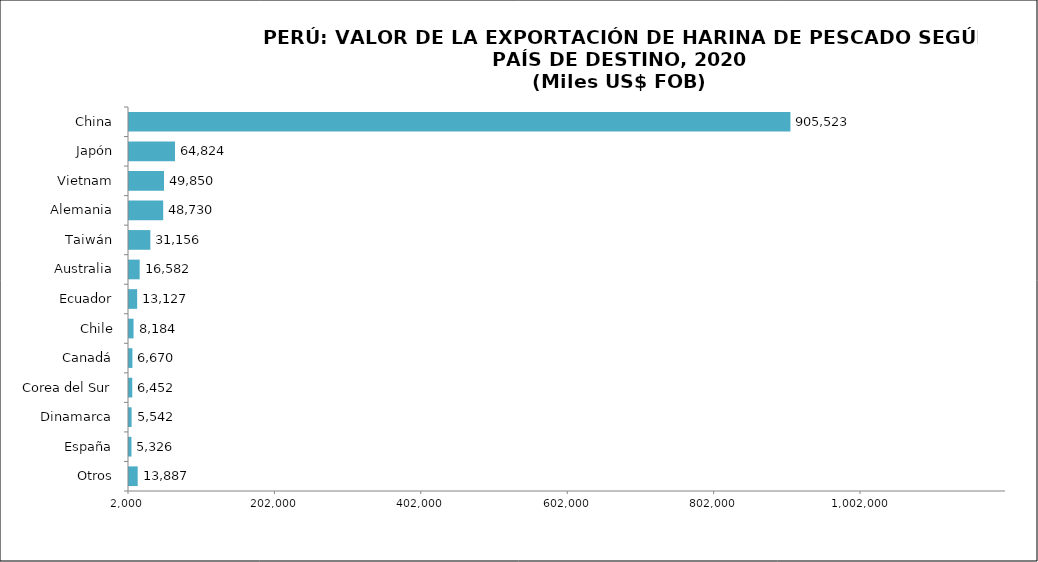
| Category | Series 0 |
|---|---|
| Otros | 13886.614 |
| España | 5325.584 |
| Dinamarca | 5542.198 |
| Corea del Sur | 6451.621 |
| Canadá | 6669.961 |
| Chile | 8183.974 |
| Ecuador | 13126.8 |
| Australia | 16582.094 |
| Taiwán | 31155.896 |
| Alemania | 48730.01 |
| Vietnam | 49850.323 |
| Japón | 64824.192 |
| China | 905522.752 |